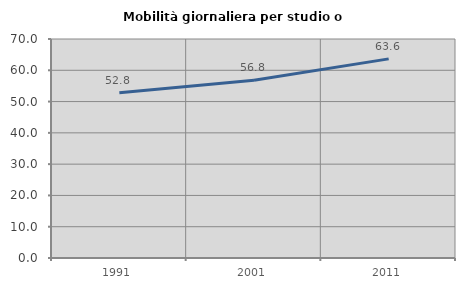
| Category | Mobilità giornaliera per studio o lavoro |
|---|---|
| 1991.0 | 52.843 |
| 2001.0 | 56.823 |
| 2011.0 | 63.647 |